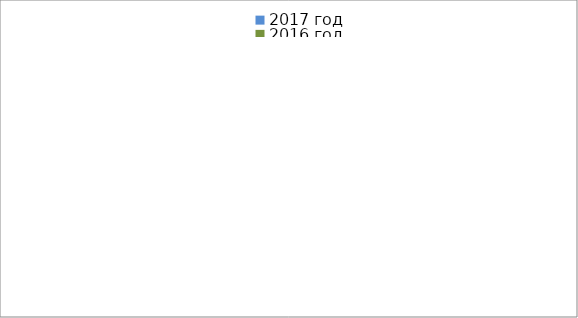
| Category | 2017 год | 2016 год |
|---|---|---|
|  - поджог | 3 | 23 |
|  - неосторожное обращение с огнём | 2 | 17 |
|  - НПТЭ электрооборудования | 8 | 4 |
|  - НПУ и Э печей | 23 | 21 |
|  - НПУ и Э транспортных средств | 33 | 10 |
|   -Шалость с огнем детей | 4 | 4 |
|  -НППБ при эксплуатации эл.приборов | 18 | 4 |
|  - курение | 18 | 6 |
| - прочие | 35 | 44 |
| - не установленные причины | 0 | 11 |